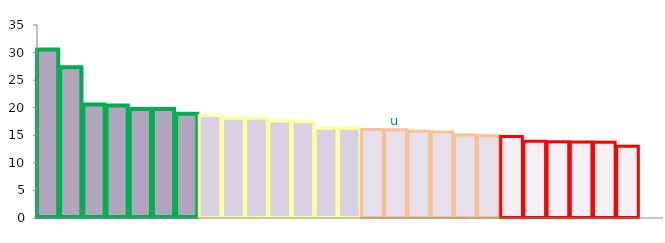
| Category | Top Quartile | 2nd Quartile | 3rd Quartile | Bottom Quartile | Series 4 |
|---|---|---|---|---|---|
|  | 30.572 | 0 | 0 | 0 | 30.572 |
|  | 27.361 | 0 | 0 | 0 | 27.361 |
|  | 20.57 | 0 | 0 | 0 | 20.57 |
|  | 20.423 | 0 | 0 | 0 | 20.423 |
|  | 19.777 | 0 | 0 | 0 | 19.777 |
|  | 19.765 | 0 | 0 | 0 | 19.765 |
|  | 18.924 | 0 | 0 | 0 | 18.924 |
|  | 0 | 18.584 | 0 | 0 | 18.584 |
|  | 0 | 18.088 | 0 | 0 | 18.088 |
|  | 0 | 18.082 | 0 | 0 | 18.082 |
|  | 0 | 17.595 | 0 | 0 | 17.595 |
|  | 0 | 17.475 | 0 | 0 | 17.475 |
|  | 0 | 16.293 | 0 | 0 | 16.293 |
|  | 0 | 16.263 | 0 | 0 | 16.263 |
|  | 0 | 0 | 16.036 | 0 | 16.036 |
| u | 0 | 0 | 16.018 | 0 | 16.018 |